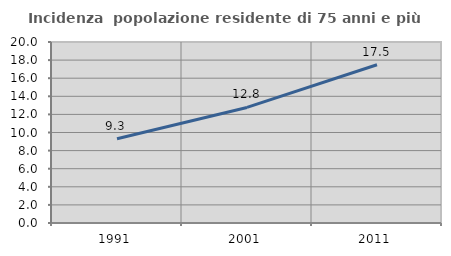
| Category | Incidenza  popolazione residente di 75 anni e più |
|---|---|
| 1991.0 | 9.313 |
| 2001.0 | 12.771 |
| 2011.0 | 17.481 |